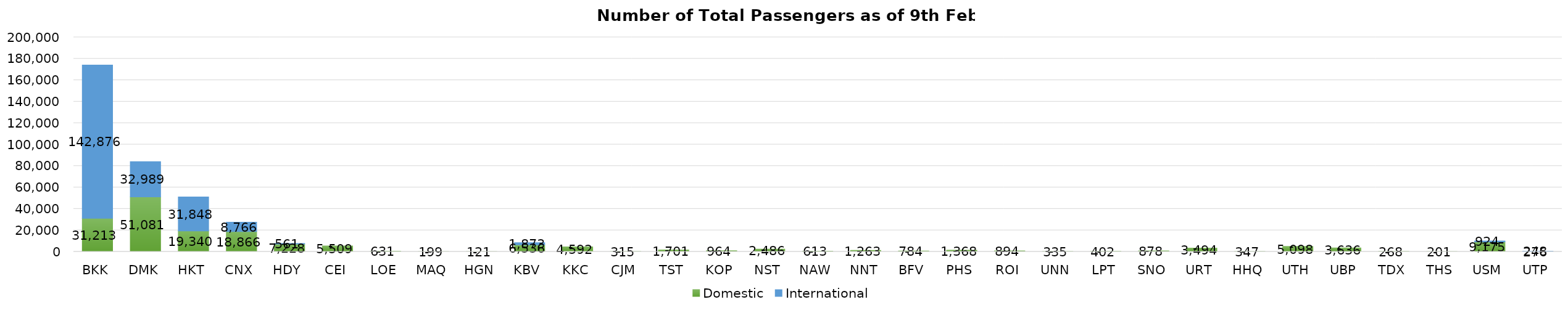
| Category | Domestic | International |
|---|---|---|
| BKK | 31213 | 142876 |
| DMK | 51081 | 32989 |
| HKT | 19340 | 31848 |
| CNX | 18866 | 8766 |
| HDY | 7228 | 561 |
| CEI | 5509 | 0 |
| LOE | 631 | 0 |
| MAQ | 199 | 0 |
| HGN | 121 | 0 |
| KBV | 6536 | 1873 |
| KKC | 4592 | 0 |
| CJM | 315 | 0 |
| TST | 1701 | 0 |
| KOP | 964 | 0 |
| NST | 2486 | 0 |
| NAW | 613 | 0 |
| NNT | 1263 | 0 |
| BFV | 784 | 0 |
| PHS | 1368 | 0 |
| ROI | 894 | 0 |
| UNN | 335 | 0 |
| LPT | 402 | 0 |
| SNO | 878 | 0 |
| URT | 3494 | 0 |
| HHQ | 347 | 0 |
| UTH | 5098 | 0 |
| UBP | 3636 | 0 |
| TDX | 268 | 0 |
| THS | 201 | 0 |
| USM | 9175 | 924 |
| UTP | 276 | 248 |